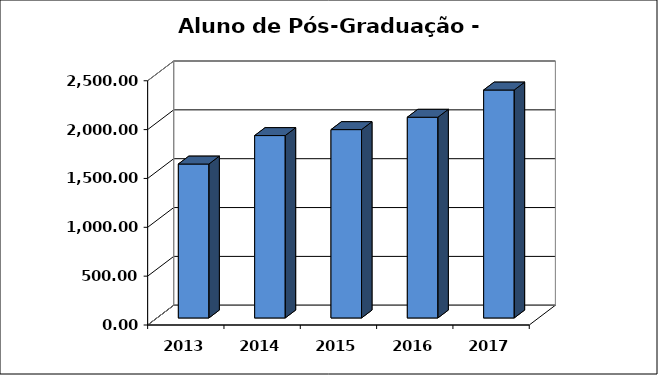
| Category | Series 0 |
|---|---|
| 2013.0 | 1575.5 |
| 2014.0 | 1867 |
| 2015.0 | 1927.917 |
| 2016.0 | 2054.49 |
| 2017.0 | 2333.083 |